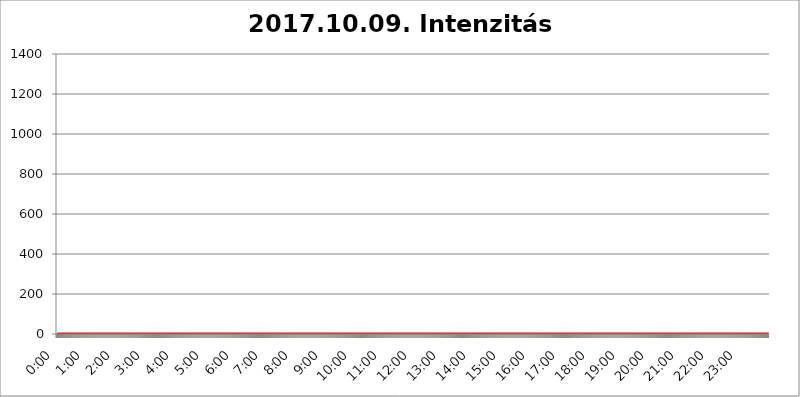
| Category | 2017.10.09. Intenzitás [W/m^2] |
|---|---|
| 0.0 | 0 |
| 0.0006944444444444445 | 0 |
| 0.001388888888888889 | 0 |
| 0.0020833333333333333 | 0 |
| 0.002777777777777778 | 0 |
| 0.003472222222222222 | 0 |
| 0.004166666666666667 | 0 |
| 0.004861111111111111 | 0 |
| 0.005555555555555556 | 0 |
| 0.0062499999999999995 | 0 |
| 0.006944444444444444 | 0 |
| 0.007638888888888889 | 0 |
| 0.008333333333333333 | 0 |
| 0.009027777777777779 | 0 |
| 0.009722222222222222 | 0 |
| 0.010416666666666666 | 0 |
| 0.011111111111111112 | 0 |
| 0.011805555555555555 | 0 |
| 0.012499999999999999 | 0 |
| 0.013194444444444444 | 0 |
| 0.013888888888888888 | 0 |
| 0.014583333333333332 | 0 |
| 0.015277777777777777 | 0 |
| 0.015972222222222224 | 0 |
| 0.016666666666666666 | 0 |
| 0.017361111111111112 | 0 |
| 0.018055555555555557 | 0 |
| 0.01875 | 0 |
| 0.019444444444444445 | 0 |
| 0.02013888888888889 | 0 |
| 0.020833333333333332 | 0 |
| 0.02152777777777778 | 0 |
| 0.022222222222222223 | 0 |
| 0.02291666666666667 | 0 |
| 0.02361111111111111 | 0 |
| 0.024305555555555556 | 0 |
| 0.024999999999999998 | 0 |
| 0.025694444444444447 | 0 |
| 0.02638888888888889 | 0 |
| 0.027083333333333334 | 0 |
| 0.027777777777777776 | 0 |
| 0.02847222222222222 | 0 |
| 0.029166666666666664 | 0 |
| 0.029861111111111113 | 0 |
| 0.030555555555555555 | 0 |
| 0.03125 | 0 |
| 0.03194444444444445 | 0 |
| 0.03263888888888889 | 0 |
| 0.03333333333333333 | 0 |
| 0.034027777777777775 | 0 |
| 0.034722222222222224 | 0 |
| 0.035416666666666666 | 0 |
| 0.036111111111111115 | 0 |
| 0.03680555555555556 | 0 |
| 0.0375 | 0 |
| 0.03819444444444444 | 0 |
| 0.03888888888888889 | 0 |
| 0.03958333333333333 | 0 |
| 0.04027777777777778 | 0 |
| 0.04097222222222222 | 0 |
| 0.041666666666666664 | 0 |
| 0.042361111111111106 | 0 |
| 0.04305555555555556 | 0 |
| 0.043750000000000004 | 0 |
| 0.044444444444444446 | 0 |
| 0.04513888888888889 | 0 |
| 0.04583333333333334 | 0 |
| 0.04652777777777778 | 0 |
| 0.04722222222222222 | 0 |
| 0.04791666666666666 | 0 |
| 0.04861111111111111 | 0 |
| 0.049305555555555554 | 0 |
| 0.049999999999999996 | 0 |
| 0.05069444444444445 | 0 |
| 0.051388888888888894 | 0 |
| 0.052083333333333336 | 0 |
| 0.05277777777777778 | 0 |
| 0.05347222222222222 | 0 |
| 0.05416666666666667 | 0 |
| 0.05486111111111111 | 0 |
| 0.05555555555555555 | 0 |
| 0.05625 | 0 |
| 0.05694444444444444 | 0 |
| 0.057638888888888885 | 0 |
| 0.05833333333333333 | 0 |
| 0.05902777777777778 | 0 |
| 0.059722222222222225 | 0 |
| 0.06041666666666667 | 0 |
| 0.061111111111111116 | 0 |
| 0.06180555555555556 | 0 |
| 0.0625 | 0 |
| 0.06319444444444444 | 0 |
| 0.06388888888888888 | 0 |
| 0.06458333333333334 | 0 |
| 0.06527777777777778 | 0 |
| 0.06597222222222222 | 0 |
| 0.06666666666666667 | 0 |
| 0.06736111111111111 | 0 |
| 0.06805555555555555 | 0 |
| 0.06874999999999999 | 0 |
| 0.06944444444444443 | 0 |
| 0.07013888888888889 | 0 |
| 0.07083333333333333 | 0 |
| 0.07152777777777779 | 0 |
| 0.07222222222222223 | 0 |
| 0.07291666666666667 | 0 |
| 0.07361111111111111 | 0 |
| 0.07430555555555556 | 0 |
| 0.075 | 0 |
| 0.07569444444444444 | 0 |
| 0.0763888888888889 | 0 |
| 0.07708333333333334 | 0 |
| 0.07777777777777778 | 0 |
| 0.07847222222222222 | 0 |
| 0.07916666666666666 | 0 |
| 0.0798611111111111 | 0 |
| 0.08055555555555556 | 0 |
| 0.08125 | 0 |
| 0.08194444444444444 | 0 |
| 0.08263888888888889 | 0 |
| 0.08333333333333333 | 0 |
| 0.08402777777777777 | 0 |
| 0.08472222222222221 | 0 |
| 0.08541666666666665 | 0 |
| 0.08611111111111112 | 0 |
| 0.08680555555555557 | 0 |
| 0.08750000000000001 | 0 |
| 0.08819444444444445 | 0 |
| 0.08888888888888889 | 0 |
| 0.08958333333333333 | 0 |
| 0.09027777777777778 | 0 |
| 0.09097222222222222 | 0 |
| 0.09166666666666667 | 0 |
| 0.09236111111111112 | 0 |
| 0.09305555555555556 | 0 |
| 0.09375 | 0 |
| 0.09444444444444444 | 0 |
| 0.09513888888888888 | 0 |
| 0.09583333333333333 | 0 |
| 0.09652777777777777 | 0 |
| 0.09722222222222222 | 0 |
| 0.09791666666666667 | 0 |
| 0.09861111111111111 | 0 |
| 0.09930555555555555 | 0 |
| 0.09999999999999999 | 0 |
| 0.10069444444444443 | 0 |
| 0.1013888888888889 | 0 |
| 0.10208333333333335 | 0 |
| 0.10277777777777779 | 0 |
| 0.10347222222222223 | 0 |
| 0.10416666666666667 | 0 |
| 0.10486111111111111 | 0 |
| 0.10555555555555556 | 0 |
| 0.10625 | 0 |
| 0.10694444444444444 | 0 |
| 0.1076388888888889 | 0 |
| 0.10833333333333334 | 0 |
| 0.10902777777777778 | 0 |
| 0.10972222222222222 | 0 |
| 0.1111111111111111 | 0 |
| 0.11180555555555556 | 0 |
| 0.11180555555555556 | 0 |
| 0.1125 | 0 |
| 0.11319444444444444 | 0 |
| 0.11388888888888889 | 0 |
| 0.11458333333333333 | 0 |
| 0.11527777777777777 | 0 |
| 0.11597222222222221 | 0 |
| 0.11666666666666665 | 0 |
| 0.1173611111111111 | 0 |
| 0.11805555555555557 | 0 |
| 0.11944444444444445 | 0 |
| 0.12013888888888889 | 0 |
| 0.12083333333333333 | 0 |
| 0.12152777777777778 | 0 |
| 0.12222222222222223 | 0 |
| 0.12291666666666667 | 0 |
| 0.12291666666666667 | 0 |
| 0.12361111111111112 | 0 |
| 0.12430555555555556 | 0 |
| 0.125 | 0 |
| 0.12569444444444444 | 0 |
| 0.12638888888888888 | 0 |
| 0.12708333333333333 | 0 |
| 0.16875 | 0 |
| 0.12847222222222224 | 0 |
| 0.12916666666666668 | 0 |
| 0.12986111111111112 | 0 |
| 0.13055555555555556 | 0 |
| 0.13125 | 0 |
| 0.13194444444444445 | 0 |
| 0.1326388888888889 | 0 |
| 0.13333333333333333 | 0 |
| 0.13402777777777777 | 0 |
| 0.13402777777777777 | 0 |
| 0.13472222222222222 | 0 |
| 0.13541666666666666 | 0 |
| 0.1361111111111111 | 0 |
| 0.13749999999999998 | 0 |
| 0.13819444444444443 | 0 |
| 0.1388888888888889 | 0 |
| 0.13958333333333334 | 0 |
| 0.14027777777777778 | 0 |
| 0.14097222222222222 | 0 |
| 0.14166666666666666 | 0 |
| 0.1423611111111111 | 0 |
| 0.14305555555555557 | 0 |
| 0.14375000000000002 | 0 |
| 0.14444444444444446 | 0 |
| 0.1451388888888889 | 0 |
| 0.1451388888888889 | 0 |
| 0.14652777777777778 | 0 |
| 0.14722222222222223 | 0 |
| 0.14791666666666667 | 0 |
| 0.1486111111111111 | 0 |
| 0.14930555555555555 | 0 |
| 0.15 | 0 |
| 0.15069444444444444 | 0 |
| 0.15138888888888888 | 0 |
| 0.15208333333333332 | 0 |
| 0.15277777777777776 | 0 |
| 0.15347222222222223 | 0 |
| 0.15416666666666667 | 0 |
| 0.15486111111111112 | 0 |
| 0.15555555555555556 | 0 |
| 0.15625 | 0 |
| 0.15694444444444444 | 0 |
| 0.15763888888888888 | 0 |
| 0.15833333333333333 | 0 |
| 0.15902777777777777 | 0 |
| 0.15972222222222224 | 0 |
| 0.16041666666666668 | 0 |
| 0.16111111111111112 | 0 |
| 0.16180555555555556 | 0 |
| 0.1625 | 0 |
| 0.16319444444444445 | 0 |
| 0.1638888888888889 | 0 |
| 0.16458333333333333 | 0 |
| 0.16527777777777777 | 0 |
| 0.16597222222222222 | 0 |
| 0.16666666666666666 | 0 |
| 0.1673611111111111 | 0 |
| 0.16805555555555554 | 0 |
| 0.16874999999999998 | 0 |
| 0.16944444444444443 | 0 |
| 0.17013888888888887 | 0 |
| 0.1708333333333333 | 0 |
| 0.17152777777777775 | 0 |
| 0.17222222222222225 | 0 |
| 0.1729166666666667 | 0 |
| 0.17361111111111113 | 0 |
| 0.17430555555555557 | 0 |
| 0.17500000000000002 | 0 |
| 0.17569444444444446 | 0 |
| 0.1763888888888889 | 0 |
| 0.17708333333333334 | 0 |
| 0.17777777777777778 | 0 |
| 0.17847222222222223 | 0 |
| 0.17916666666666667 | 0 |
| 0.1798611111111111 | 0 |
| 0.18055555555555555 | 0 |
| 0.18125 | 0 |
| 0.18194444444444444 | 0 |
| 0.1826388888888889 | 0 |
| 0.18333333333333335 | 0 |
| 0.1840277777777778 | 0 |
| 0.18472222222222223 | 0 |
| 0.18541666666666667 | 0 |
| 0.18611111111111112 | 0 |
| 0.18680555555555556 | 0 |
| 0.1875 | 0 |
| 0.18819444444444444 | 0 |
| 0.18888888888888888 | 0 |
| 0.18958333333333333 | 0 |
| 0.19027777777777777 | 0 |
| 0.1909722222222222 | 0 |
| 0.19166666666666665 | 0 |
| 0.19236111111111112 | 0 |
| 0.19305555555555554 | 0 |
| 0.19375 | 0 |
| 0.19444444444444445 | 0 |
| 0.1951388888888889 | 0 |
| 0.19583333333333333 | 0 |
| 0.19652777777777777 | 0 |
| 0.19722222222222222 | 0 |
| 0.19791666666666666 | 0 |
| 0.1986111111111111 | 0 |
| 0.19930555555555554 | 0 |
| 0.19999999999999998 | 0 |
| 0.20069444444444443 | 0 |
| 0.20138888888888887 | 0 |
| 0.2020833333333333 | 0 |
| 0.2027777777777778 | 0 |
| 0.2034722222222222 | 0 |
| 0.2041666666666667 | 0 |
| 0.20486111111111113 | 0 |
| 0.20555555555555557 | 0 |
| 0.20625000000000002 | 0 |
| 0.20694444444444446 | 0 |
| 0.2076388888888889 | 0 |
| 0.20833333333333334 | 0 |
| 0.20902777777777778 | 0 |
| 0.20972222222222223 | 0 |
| 0.21041666666666667 | 0 |
| 0.2111111111111111 | 0 |
| 0.21180555555555555 | 0 |
| 0.2125 | 0 |
| 0.21319444444444444 | 0 |
| 0.2138888888888889 | 0 |
| 0.21458333333333335 | 0 |
| 0.2152777777777778 | 0 |
| 0.21597222222222223 | 0 |
| 0.21666666666666667 | 0 |
| 0.21736111111111112 | 0 |
| 0.21805555555555556 | 0 |
| 0.21875 | 0 |
| 0.21944444444444444 | 0 |
| 0.22013888888888888 | 0 |
| 0.22083333333333333 | 0 |
| 0.22152777777777777 | 0 |
| 0.2222222222222222 | 0 |
| 0.22291666666666665 | 0 |
| 0.2236111111111111 | 0 |
| 0.22430555555555556 | 0 |
| 0.225 | 0 |
| 0.22569444444444445 | 0 |
| 0.2263888888888889 | 0 |
| 0.22708333333333333 | 0 |
| 0.22777777777777777 | 0 |
| 0.22847222222222222 | 0 |
| 0.22916666666666666 | 0 |
| 0.2298611111111111 | 0 |
| 0.23055555555555554 | 0 |
| 0.23124999999999998 | 0 |
| 0.23194444444444443 | 0 |
| 0.23263888888888887 | 0 |
| 0.2333333333333333 | 0 |
| 0.2340277777777778 | 0 |
| 0.2347222222222222 | 0 |
| 0.2354166666666667 | 0 |
| 0.23611111111111113 | 0 |
| 0.23680555555555557 | 0 |
| 0.23750000000000002 | 0 |
| 0.23819444444444446 | 0 |
| 0.2388888888888889 | 0 |
| 0.23958333333333334 | 0 |
| 0.24027777777777778 | 0 |
| 0.24097222222222223 | 0 |
| 0.24166666666666667 | 0 |
| 0.2423611111111111 | 0 |
| 0.24305555555555555 | 0 |
| 0.24375 | 0 |
| 0.24444444444444446 | 0 |
| 0.24513888888888888 | 0 |
| 0.24583333333333335 | 0 |
| 0.2465277777777778 | 0 |
| 0.24722222222222223 | 0 |
| 0.24791666666666667 | 0 |
| 0.24861111111111112 | 0 |
| 0.24930555555555556 | 0 |
| 0.25 | 0 |
| 0.25069444444444444 | 0 |
| 0.2513888888888889 | 0 |
| 0.2520833333333333 | 0 |
| 0.25277777777777777 | 0 |
| 0.2534722222222222 | 0 |
| 0.25416666666666665 | 0 |
| 0.2548611111111111 | 0 |
| 0.2555555555555556 | 0 |
| 0.25625000000000003 | 0 |
| 0.2569444444444445 | 0 |
| 0.2576388888888889 | 0 |
| 0.25833333333333336 | 0 |
| 0.2590277777777778 | 0 |
| 0.25972222222222224 | 0 |
| 0.2604166666666667 | 0 |
| 0.2611111111111111 | 0 |
| 0.26180555555555557 | 0 |
| 0.2625 | 0 |
| 0.26319444444444445 | 0 |
| 0.2638888888888889 | 0 |
| 0.26458333333333334 | 0 |
| 0.2652777777777778 | 0 |
| 0.2659722222222222 | 0 |
| 0.26666666666666666 | 0 |
| 0.2673611111111111 | 0 |
| 0.26805555555555555 | 0 |
| 0.26875 | 0 |
| 0.26944444444444443 | 0 |
| 0.2701388888888889 | 0 |
| 0.2708333333333333 | 0 |
| 0.27152777777777776 | 0 |
| 0.2722222222222222 | 0 |
| 0.27291666666666664 | 0 |
| 0.2736111111111111 | 0 |
| 0.2743055555555555 | 0 |
| 0.27499999999999997 | 0 |
| 0.27569444444444446 | 0 |
| 0.27638888888888885 | 0 |
| 0.27708333333333335 | 0 |
| 0.2777777777777778 | 0 |
| 0.27847222222222223 | 0 |
| 0.2791666666666667 | 0 |
| 0.2798611111111111 | 0 |
| 0.28055555555555556 | 0 |
| 0.28125 | 0 |
| 0.28194444444444444 | 0 |
| 0.2826388888888889 | 0 |
| 0.2833333333333333 | 0 |
| 0.28402777777777777 | 0 |
| 0.2847222222222222 | 0 |
| 0.28541666666666665 | 0 |
| 0.28611111111111115 | 0 |
| 0.28680555555555554 | 0 |
| 0.28750000000000003 | 0 |
| 0.2881944444444445 | 0 |
| 0.2888888888888889 | 0 |
| 0.28958333333333336 | 0 |
| 0.2902777777777778 | 0 |
| 0.29097222222222224 | 0 |
| 0.2916666666666667 | 0 |
| 0.2923611111111111 | 0 |
| 0.29305555555555557 | 0 |
| 0.29375 | 0 |
| 0.29444444444444445 | 0 |
| 0.2951388888888889 | 0 |
| 0.29583333333333334 | 0 |
| 0.2965277777777778 | 0 |
| 0.2972222222222222 | 0 |
| 0.29791666666666666 | 0 |
| 0.2986111111111111 | 0 |
| 0.29930555555555555 | 0 |
| 0.3 | 0 |
| 0.30069444444444443 | 0 |
| 0.3013888888888889 | 0 |
| 0.3020833333333333 | 0 |
| 0.30277777777777776 | 0 |
| 0.3034722222222222 | 0 |
| 0.30416666666666664 | 0 |
| 0.3048611111111111 | 0 |
| 0.3055555555555555 | 0 |
| 0.30624999999999997 | 0 |
| 0.3069444444444444 | 0 |
| 0.3076388888888889 | 0 |
| 0.30833333333333335 | 0 |
| 0.3090277777777778 | 0 |
| 0.30972222222222223 | 0 |
| 0.3104166666666667 | 0 |
| 0.3111111111111111 | 0 |
| 0.31180555555555556 | 0 |
| 0.3125 | 0 |
| 0.31319444444444444 | 0 |
| 0.3138888888888889 | 0 |
| 0.3145833333333333 | 0 |
| 0.31527777777777777 | 0 |
| 0.3159722222222222 | 0 |
| 0.31666666666666665 | 0 |
| 0.31736111111111115 | 0 |
| 0.31805555555555554 | 0 |
| 0.31875000000000003 | 0 |
| 0.3194444444444445 | 0 |
| 0.3201388888888889 | 0 |
| 0.32083333333333336 | 0 |
| 0.3215277777777778 | 0 |
| 0.32222222222222224 | 0 |
| 0.3229166666666667 | 0 |
| 0.3236111111111111 | 0 |
| 0.32430555555555557 | 0 |
| 0.325 | 0 |
| 0.32569444444444445 | 0 |
| 0.3263888888888889 | 0 |
| 0.32708333333333334 | 0 |
| 0.3277777777777778 | 0 |
| 0.3284722222222222 | 0 |
| 0.32916666666666666 | 0 |
| 0.3298611111111111 | 0 |
| 0.33055555555555555 | 0 |
| 0.33125 | 0 |
| 0.33194444444444443 | 0 |
| 0.3326388888888889 | 0 |
| 0.3333333333333333 | 0 |
| 0.3340277777777778 | 0 |
| 0.3347222222222222 | 0 |
| 0.3354166666666667 | 0 |
| 0.3361111111111111 | 0 |
| 0.3368055555555556 | 0 |
| 0.33749999999999997 | 0 |
| 0.33819444444444446 | 0 |
| 0.33888888888888885 | 0 |
| 0.33958333333333335 | 0 |
| 0.34027777777777773 | 0 |
| 0.34097222222222223 | 0 |
| 0.3416666666666666 | 0 |
| 0.3423611111111111 | 0 |
| 0.3430555555555555 | 0 |
| 0.34375 | 0 |
| 0.3444444444444445 | 0 |
| 0.3451388888888889 | 0 |
| 0.3458333333333334 | 0 |
| 0.34652777777777777 | 0 |
| 0.34722222222222227 | 0 |
| 0.34791666666666665 | 0 |
| 0.34861111111111115 | 0 |
| 0.34930555555555554 | 0 |
| 0.35000000000000003 | 0 |
| 0.3506944444444444 | 0 |
| 0.3513888888888889 | 0 |
| 0.3520833333333333 | 0 |
| 0.3527777777777778 | 0 |
| 0.3534722222222222 | 0 |
| 0.3541666666666667 | 0 |
| 0.3548611111111111 | 0 |
| 0.35555555555555557 | 0 |
| 0.35625 | 0 |
| 0.35694444444444445 | 0 |
| 0.3576388888888889 | 0 |
| 0.35833333333333334 | 0 |
| 0.3590277777777778 | 0 |
| 0.3597222222222222 | 0 |
| 0.36041666666666666 | 0 |
| 0.3611111111111111 | 0 |
| 0.36180555555555555 | 0 |
| 0.3625 | 0 |
| 0.36319444444444443 | 0 |
| 0.3638888888888889 | 0 |
| 0.3645833333333333 | 0 |
| 0.3652777777777778 | 0 |
| 0.3659722222222222 | 0 |
| 0.3666666666666667 | 0 |
| 0.3673611111111111 | 0 |
| 0.3680555555555556 | 0 |
| 0.36874999999999997 | 0 |
| 0.36944444444444446 | 0 |
| 0.37013888888888885 | 0 |
| 0.37083333333333335 | 0 |
| 0.37152777777777773 | 0 |
| 0.37222222222222223 | 0 |
| 0.3729166666666666 | 0 |
| 0.3736111111111111 | 0 |
| 0.3743055555555555 | 0 |
| 0.375 | 0 |
| 0.3756944444444445 | 0 |
| 0.3763888888888889 | 0 |
| 0.3770833333333334 | 0 |
| 0.37777777777777777 | 0 |
| 0.37847222222222227 | 0 |
| 0.37916666666666665 | 0 |
| 0.37986111111111115 | 0 |
| 0.38055555555555554 | 0 |
| 0.38125000000000003 | 0 |
| 0.3819444444444444 | 0 |
| 0.3826388888888889 | 0 |
| 0.3833333333333333 | 0 |
| 0.3840277777777778 | 0 |
| 0.3847222222222222 | 0 |
| 0.3854166666666667 | 0 |
| 0.3861111111111111 | 0 |
| 0.38680555555555557 | 0 |
| 0.3875 | 0 |
| 0.38819444444444445 | 0 |
| 0.3888888888888889 | 0 |
| 0.38958333333333334 | 0 |
| 0.3902777777777778 | 0 |
| 0.3909722222222222 | 0 |
| 0.39166666666666666 | 0 |
| 0.3923611111111111 | 0 |
| 0.39305555555555555 | 0 |
| 0.39375 | 0 |
| 0.39444444444444443 | 0 |
| 0.3951388888888889 | 0 |
| 0.3958333333333333 | 0 |
| 0.3965277777777778 | 0 |
| 0.3972222222222222 | 0 |
| 0.3979166666666667 | 0 |
| 0.3986111111111111 | 0 |
| 0.3993055555555556 | 0 |
| 0.39999999999999997 | 0 |
| 0.40069444444444446 | 0 |
| 0.40138888888888885 | 0 |
| 0.40208333333333335 | 0 |
| 0.40277777777777773 | 0 |
| 0.40347222222222223 | 0 |
| 0.4041666666666666 | 0 |
| 0.4048611111111111 | 0 |
| 0.4055555555555555 | 0 |
| 0.40625 | 0 |
| 0.4069444444444445 | 0 |
| 0.4076388888888889 | 0 |
| 0.4083333333333334 | 0 |
| 0.40902777777777777 | 0 |
| 0.40972222222222227 | 0 |
| 0.41041666666666665 | 0 |
| 0.41111111111111115 | 0 |
| 0.41180555555555554 | 0 |
| 0.41250000000000003 | 0 |
| 0.4131944444444444 | 0 |
| 0.4138888888888889 | 0 |
| 0.4145833333333333 | 0 |
| 0.4152777777777778 | 0 |
| 0.4159722222222222 | 0 |
| 0.4166666666666667 | 0 |
| 0.4173611111111111 | 0 |
| 0.41805555555555557 | 0 |
| 0.41875 | 0 |
| 0.41944444444444445 | 0 |
| 0.4201388888888889 | 0 |
| 0.42083333333333334 | 0 |
| 0.4215277777777778 | 0 |
| 0.4222222222222222 | 0 |
| 0.42291666666666666 | 0 |
| 0.4236111111111111 | 0 |
| 0.42430555555555555 | 0 |
| 0.425 | 0 |
| 0.42569444444444443 | 0 |
| 0.4263888888888889 | 0 |
| 0.4270833333333333 | 0 |
| 0.4277777777777778 | 0 |
| 0.4284722222222222 | 0 |
| 0.4291666666666667 | 0 |
| 0.4298611111111111 | 0 |
| 0.4305555555555556 | 0 |
| 0.43124999999999997 | 0 |
| 0.43194444444444446 | 0 |
| 0.43263888888888885 | 0 |
| 0.43333333333333335 | 0 |
| 0.43402777777777773 | 0 |
| 0.43472222222222223 | 0 |
| 0.4354166666666666 | 0 |
| 0.4361111111111111 | 0 |
| 0.4368055555555555 | 0 |
| 0.4375 | 0 |
| 0.4381944444444445 | 0 |
| 0.4388888888888889 | 0 |
| 0.4395833333333334 | 0 |
| 0.44027777777777777 | 0 |
| 0.44097222222222227 | 0 |
| 0.44166666666666665 | 0 |
| 0.44236111111111115 | 0 |
| 0.44305555555555554 | 0 |
| 0.44375000000000003 | 0 |
| 0.4444444444444444 | 0 |
| 0.4451388888888889 | 0 |
| 0.4458333333333333 | 0 |
| 0.4465277777777778 | 0 |
| 0.4472222222222222 | 0 |
| 0.4479166666666667 | 0 |
| 0.4486111111111111 | 0 |
| 0.44930555555555557 | 0 |
| 0.45 | 0 |
| 0.45069444444444445 | 0 |
| 0.4513888888888889 | 0 |
| 0.45208333333333334 | 0 |
| 0.4527777777777778 | 0 |
| 0.4534722222222222 | 0 |
| 0.45416666666666666 | 0 |
| 0.4548611111111111 | 0 |
| 0.45555555555555555 | 0 |
| 0.45625 | 0 |
| 0.45694444444444443 | 0 |
| 0.4576388888888889 | 0 |
| 0.4583333333333333 | 0 |
| 0.4590277777777778 | 0 |
| 0.4597222222222222 | 0 |
| 0.4604166666666667 | 0 |
| 0.4611111111111111 | 0 |
| 0.4618055555555556 | 0 |
| 0.46249999999999997 | 0 |
| 0.46319444444444446 | 0 |
| 0.46388888888888885 | 0 |
| 0.46458333333333335 | 0 |
| 0.46527777777777773 | 0 |
| 0.46597222222222223 | 0 |
| 0.4666666666666666 | 0 |
| 0.4673611111111111 | 0 |
| 0.4680555555555555 | 0 |
| 0.46875 | 0 |
| 0.4694444444444445 | 0 |
| 0.4701388888888889 | 0 |
| 0.4708333333333334 | 0 |
| 0.47152777777777777 | 0 |
| 0.47222222222222227 | 0 |
| 0.47291666666666665 | 0 |
| 0.47361111111111115 | 0 |
| 0.47430555555555554 | 0 |
| 0.47500000000000003 | 0 |
| 0.4756944444444444 | 0 |
| 0.4763888888888889 | 0 |
| 0.4770833333333333 | 0 |
| 0.4777777777777778 | 0 |
| 0.4784722222222222 | 0 |
| 0.4791666666666667 | 0 |
| 0.4798611111111111 | 0 |
| 0.48055555555555557 | 0 |
| 0.48125 | 0 |
| 0.48194444444444445 | 0 |
| 0.4826388888888889 | 0 |
| 0.48333333333333334 | 0 |
| 0.4840277777777778 | 0 |
| 0.4847222222222222 | 0 |
| 0.48541666666666666 | 0 |
| 0.4861111111111111 | 0 |
| 0.48680555555555555 | 0 |
| 0.4875 | 0 |
| 0.48819444444444443 | 0 |
| 0.4888888888888889 | 0 |
| 0.4895833333333333 | 0 |
| 0.4902777777777778 | 0 |
| 0.4909722222222222 | 0 |
| 0.4916666666666667 | 0 |
| 0.4923611111111111 | 0 |
| 0.4930555555555556 | 0 |
| 0.49374999999999997 | 0 |
| 0.49444444444444446 | 0 |
| 0.49513888888888885 | 0 |
| 0.49583333333333335 | 0 |
| 0.49652777777777773 | 0 |
| 0.49722222222222223 | 0 |
| 0.4979166666666666 | 0 |
| 0.4986111111111111 | 0 |
| 0.4993055555555555 | 0 |
| 0.5 | 0 |
| 0.5006944444444444 | 0 |
| 0.5013888888888889 | 0 |
| 0.5020833333333333 | 0 |
| 0.5027777777777778 | 0 |
| 0.5034722222222222 | 0 |
| 0.5041666666666667 | 0 |
| 0.5048611111111111 | 0 |
| 0.5055555555555555 | 0 |
| 0.50625 | 0 |
| 0.5069444444444444 | 0 |
| 0.5076388888888889 | 0 |
| 0.5083333333333333 | 0 |
| 0.5090277777777777 | 0 |
| 0.5097222222222222 | 0 |
| 0.5104166666666666 | 0 |
| 0.5111111111111112 | 0 |
| 0.5118055555555555 | 0 |
| 0.5125000000000001 | 0 |
| 0.5131944444444444 | 0 |
| 0.513888888888889 | 0 |
| 0.5145833333333333 | 0 |
| 0.5152777777777778 | 0 |
| 0.5159722222222222 | 0 |
| 0.5166666666666667 | 0 |
| 0.517361111111111 | 0 |
| 0.5180555555555556 | 0 |
| 0.5187499999999999 | 0 |
| 0.5194444444444445 | 0 |
| 0.5201388888888888 | 0 |
| 0.5208333333333334 | 0 |
| 0.5215277777777778 | 0 |
| 0.5222222222222223 | 0 |
| 0.5229166666666667 | 0 |
| 0.5236111111111111 | 0 |
| 0.5243055555555556 | 0 |
| 0.525 | 0 |
| 0.5256944444444445 | 0 |
| 0.5263888888888889 | 0 |
| 0.5270833333333333 | 0 |
| 0.5277777777777778 | 0 |
| 0.5284722222222222 | 0 |
| 0.5291666666666667 | 0 |
| 0.5298611111111111 | 0 |
| 0.5305555555555556 | 0 |
| 0.53125 | 0 |
| 0.5319444444444444 | 0 |
| 0.5326388888888889 | 0 |
| 0.5333333333333333 | 0 |
| 0.5340277777777778 | 0 |
| 0.5347222222222222 | 0 |
| 0.5354166666666667 | 0 |
| 0.5361111111111111 | 0 |
| 0.5368055555555555 | 0 |
| 0.5375 | 0 |
| 0.5381944444444444 | 0 |
| 0.5388888888888889 | 0 |
| 0.5395833333333333 | 0 |
| 0.5402777777777777 | 0 |
| 0.5409722222222222 | 0 |
| 0.5416666666666666 | 0 |
| 0.5423611111111112 | 0 |
| 0.5430555555555555 | 0 |
| 0.5437500000000001 | 0 |
| 0.5444444444444444 | 0 |
| 0.545138888888889 | 0 |
| 0.5458333333333333 | 0 |
| 0.5465277777777778 | 0 |
| 0.5472222222222222 | 0 |
| 0.5479166666666667 | 0 |
| 0.548611111111111 | 0 |
| 0.5493055555555556 | 0 |
| 0.5499999999999999 | 0 |
| 0.5506944444444445 | 0 |
| 0.5513888888888888 | 0 |
| 0.5520833333333334 | 0 |
| 0.5527777777777778 | 0 |
| 0.5534722222222223 | 0 |
| 0.5541666666666667 | 0 |
| 0.5548611111111111 | 0 |
| 0.5555555555555556 | 0 |
| 0.55625 | 0 |
| 0.5569444444444445 | 0 |
| 0.5576388888888889 | 0 |
| 0.5583333333333333 | 0 |
| 0.5590277777777778 | 0 |
| 0.5597222222222222 | 0 |
| 0.5604166666666667 | 0 |
| 0.5611111111111111 | 0 |
| 0.5618055555555556 | 0 |
| 0.5625 | 0 |
| 0.5631944444444444 | 0 |
| 0.5638888888888889 | 0 |
| 0.5645833333333333 | 0 |
| 0.5652777777777778 | 0 |
| 0.5659722222222222 | 0 |
| 0.5666666666666667 | 0 |
| 0.5673611111111111 | 0 |
| 0.5680555555555555 | 0 |
| 0.56875 | 0 |
| 0.5694444444444444 | 0 |
| 0.5701388888888889 | 0 |
| 0.5708333333333333 | 0 |
| 0.5715277777777777 | 0 |
| 0.5722222222222222 | 0 |
| 0.5729166666666666 | 0 |
| 0.5736111111111112 | 0 |
| 0.5743055555555555 | 0 |
| 0.5750000000000001 | 0 |
| 0.5756944444444444 | 0 |
| 0.576388888888889 | 0 |
| 0.5770833333333333 | 0 |
| 0.5777777777777778 | 0 |
| 0.5784722222222222 | 0 |
| 0.5791666666666667 | 0 |
| 0.579861111111111 | 0 |
| 0.5805555555555556 | 0 |
| 0.5812499999999999 | 0 |
| 0.5819444444444445 | 0 |
| 0.5826388888888888 | 0 |
| 0.5833333333333334 | 0 |
| 0.5840277777777778 | 0 |
| 0.5847222222222223 | 0 |
| 0.5854166666666667 | 0 |
| 0.5861111111111111 | 0 |
| 0.5868055555555556 | 0 |
| 0.5875 | 0 |
| 0.5881944444444445 | 0 |
| 0.5888888888888889 | 0 |
| 0.5895833333333333 | 0 |
| 0.5902777777777778 | 0 |
| 0.5909722222222222 | 0 |
| 0.5916666666666667 | 0 |
| 0.5923611111111111 | 0 |
| 0.5930555555555556 | 0 |
| 0.59375 | 0 |
| 0.5944444444444444 | 0 |
| 0.5951388888888889 | 0 |
| 0.5958333333333333 | 0 |
| 0.5965277777777778 | 0 |
| 0.5972222222222222 | 0 |
| 0.5979166666666667 | 0 |
| 0.5986111111111111 | 0 |
| 0.5993055555555555 | 0 |
| 0.6 | 0 |
| 0.6006944444444444 | 0 |
| 0.6013888888888889 | 0 |
| 0.6020833333333333 | 0 |
| 0.6027777777777777 | 0 |
| 0.6034722222222222 | 0 |
| 0.6041666666666666 | 0 |
| 0.6048611111111112 | 0 |
| 0.6055555555555555 | 0 |
| 0.6062500000000001 | 0 |
| 0.6069444444444444 | 0 |
| 0.607638888888889 | 0 |
| 0.6083333333333333 | 0 |
| 0.6090277777777778 | 0 |
| 0.6097222222222222 | 0 |
| 0.6104166666666667 | 0 |
| 0.611111111111111 | 0 |
| 0.6118055555555556 | 0 |
| 0.6124999999999999 | 0 |
| 0.6131944444444445 | 0 |
| 0.6138888888888888 | 0 |
| 0.6145833333333334 | 0 |
| 0.6152777777777778 | 0 |
| 0.6159722222222223 | 0 |
| 0.6166666666666667 | 0 |
| 0.6173611111111111 | 0 |
| 0.6180555555555556 | 0 |
| 0.61875 | 0 |
| 0.6194444444444445 | 0 |
| 0.6201388888888889 | 0 |
| 0.6208333333333333 | 0 |
| 0.6215277777777778 | 0 |
| 0.6222222222222222 | 0 |
| 0.6229166666666667 | 0 |
| 0.6236111111111111 | 0 |
| 0.6243055555555556 | 0 |
| 0.625 | 0 |
| 0.6256944444444444 | 0 |
| 0.6263888888888889 | 0 |
| 0.6270833333333333 | 0 |
| 0.6277777777777778 | 0 |
| 0.6284722222222222 | 0 |
| 0.6291666666666667 | 0 |
| 0.6298611111111111 | 0 |
| 0.6305555555555555 | 0 |
| 0.63125 | 0 |
| 0.6319444444444444 | 0 |
| 0.6326388888888889 | 0 |
| 0.6333333333333333 | 0 |
| 0.6340277777777777 | 0 |
| 0.6347222222222222 | 0 |
| 0.6354166666666666 | 0 |
| 0.6361111111111112 | 0 |
| 0.6368055555555555 | 0 |
| 0.6375000000000001 | 0 |
| 0.6381944444444444 | 0 |
| 0.638888888888889 | 0 |
| 0.6395833333333333 | 0 |
| 0.6402777777777778 | 0 |
| 0.6409722222222222 | 0 |
| 0.6416666666666667 | 0 |
| 0.642361111111111 | 0 |
| 0.6430555555555556 | 0 |
| 0.6437499999999999 | 0 |
| 0.6444444444444445 | 0 |
| 0.6451388888888888 | 0 |
| 0.6458333333333334 | 0 |
| 0.6465277777777778 | 0 |
| 0.6472222222222223 | 0 |
| 0.6479166666666667 | 0 |
| 0.6486111111111111 | 0 |
| 0.6493055555555556 | 0 |
| 0.65 | 0 |
| 0.6506944444444445 | 0 |
| 0.6513888888888889 | 0 |
| 0.6520833333333333 | 0 |
| 0.6527777777777778 | 0 |
| 0.6534722222222222 | 0 |
| 0.6541666666666667 | 0 |
| 0.6548611111111111 | 0 |
| 0.6555555555555556 | 0 |
| 0.65625 | 0 |
| 0.6569444444444444 | 0 |
| 0.6576388888888889 | 0 |
| 0.6583333333333333 | 0 |
| 0.6590277777777778 | 0 |
| 0.6597222222222222 | 0 |
| 0.6604166666666667 | 0 |
| 0.6611111111111111 | 0 |
| 0.6618055555555555 | 0 |
| 0.6625 | 0 |
| 0.6631944444444444 | 0 |
| 0.6638888888888889 | 0 |
| 0.6645833333333333 | 0 |
| 0.6652777777777777 | 0 |
| 0.6659722222222222 | 0 |
| 0.6666666666666666 | 0 |
| 0.6673611111111111 | 0 |
| 0.6680555555555556 | 0 |
| 0.6687500000000001 | 0 |
| 0.6694444444444444 | 0 |
| 0.6701388888888888 | 0 |
| 0.6708333333333334 | 0 |
| 0.6715277777777778 | 0 |
| 0.6722222222222222 | 0 |
| 0.6729166666666666 | 0 |
| 0.6736111111111112 | 0 |
| 0.6743055555555556 | 0 |
| 0.6749999999999999 | 0 |
| 0.6756944444444444 | 0 |
| 0.6763888888888889 | 0 |
| 0.6770833333333334 | 0 |
| 0.6777777777777777 | 0 |
| 0.6784722222222223 | 0 |
| 0.6791666666666667 | 0 |
| 0.6798611111111111 | 0 |
| 0.6805555555555555 | 0 |
| 0.68125 | 0 |
| 0.6819444444444445 | 0 |
| 0.6826388888888889 | 0 |
| 0.6833333333333332 | 0 |
| 0.6840277777777778 | 0 |
| 0.6847222222222222 | 0 |
| 0.6854166666666667 | 0 |
| 0.686111111111111 | 0 |
| 0.6868055555555556 | 0 |
| 0.6875 | 0 |
| 0.6881944444444444 | 0 |
| 0.688888888888889 | 0 |
| 0.6895833333333333 | 0 |
| 0.6902777777777778 | 0 |
| 0.6909722222222222 | 0 |
| 0.6916666666666668 | 0 |
| 0.6923611111111111 | 0 |
| 0.6930555555555555 | 0 |
| 0.69375 | 0 |
| 0.6944444444444445 | 0 |
| 0.6951388888888889 | 0 |
| 0.6958333333333333 | 0 |
| 0.6965277777777777 | 0 |
| 0.6972222222222223 | 0 |
| 0.6979166666666666 | 0 |
| 0.6986111111111111 | 0 |
| 0.6993055555555556 | 0 |
| 0.7000000000000001 | 0 |
| 0.7006944444444444 | 0 |
| 0.7013888888888888 | 0 |
| 0.7020833333333334 | 0 |
| 0.7027777777777778 | 0 |
| 0.7034722222222222 | 0 |
| 0.7041666666666666 | 0 |
| 0.7048611111111112 | 0 |
| 0.7055555555555556 | 0 |
| 0.7062499999999999 | 0 |
| 0.7069444444444444 | 0 |
| 0.7076388888888889 | 0 |
| 0.7083333333333334 | 0 |
| 0.7090277777777777 | 0 |
| 0.7097222222222223 | 0 |
| 0.7104166666666667 | 0 |
| 0.7111111111111111 | 0 |
| 0.7118055555555555 | 0 |
| 0.7125 | 0 |
| 0.7131944444444445 | 0 |
| 0.7138888888888889 | 0 |
| 0.7145833333333332 | 0 |
| 0.7152777777777778 | 0 |
| 0.7159722222222222 | 0 |
| 0.7166666666666667 | 0 |
| 0.717361111111111 | 0 |
| 0.7180555555555556 | 0 |
| 0.71875 | 0 |
| 0.7194444444444444 | 0 |
| 0.720138888888889 | 0 |
| 0.7208333333333333 | 0 |
| 0.7215277777777778 | 0 |
| 0.7222222222222222 | 0 |
| 0.7229166666666668 | 0 |
| 0.7236111111111111 | 0 |
| 0.7243055555555555 | 0 |
| 0.725 | 0 |
| 0.7256944444444445 | 0 |
| 0.7263888888888889 | 0 |
| 0.7270833333333333 | 0 |
| 0.7277777777777777 | 0 |
| 0.7284722222222223 | 0 |
| 0.7291666666666666 | 0 |
| 0.7298611111111111 | 0 |
| 0.7305555555555556 | 0 |
| 0.7312500000000001 | 0 |
| 0.7319444444444444 | 0 |
| 0.7326388888888888 | 0 |
| 0.7333333333333334 | 0 |
| 0.7340277777777778 | 0 |
| 0.7347222222222222 | 0 |
| 0.7354166666666666 | 0 |
| 0.7361111111111112 | 0 |
| 0.7368055555555556 | 0 |
| 0.7374999999999999 | 0 |
| 0.7381944444444444 | 0 |
| 0.7388888888888889 | 0 |
| 0.7395833333333334 | 0 |
| 0.7402777777777777 | 0 |
| 0.7409722222222223 | 0 |
| 0.7416666666666667 | 0 |
| 0.7423611111111111 | 0 |
| 0.7430555555555555 | 0 |
| 0.74375 | 0 |
| 0.7444444444444445 | 0 |
| 0.7451388888888889 | 0 |
| 0.7458333333333332 | 0 |
| 0.7465277777777778 | 0 |
| 0.7472222222222222 | 0 |
| 0.7479166666666667 | 0 |
| 0.748611111111111 | 0 |
| 0.7493055555555556 | 0 |
| 0.75 | 0 |
| 0.7506944444444444 | 0 |
| 0.751388888888889 | 0 |
| 0.7520833333333333 | 0 |
| 0.7527777777777778 | 0 |
| 0.7534722222222222 | 0 |
| 0.7541666666666668 | 0 |
| 0.7548611111111111 | 0 |
| 0.7555555555555555 | 0 |
| 0.75625 | 0 |
| 0.7569444444444445 | 0 |
| 0.7576388888888889 | 0 |
| 0.7583333333333333 | 0 |
| 0.7590277777777777 | 0 |
| 0.7597222222222223 | 0 |
| 0.7604166666666666 | 0 |
| 0.7611111111111111 | 0 |
| 0.7618055555555556 | 0 |
| 0.7625000000000001 | 0 |
| 0.7631944444444444 | 0 |
| 0.7638888888888888 | 0 |
| 0.7645833333333334 | 0 |
| 0.7652777777777778 | 0 |
| 0.7659722222222222 | 0 |
| 0.7666666666666666 | 0 |
| 0.7673611111111112 | 0 |
| 0.7680555555555556 | 0 |
| 0.7687499999999999 | 0 |
| 0.7694444444444444 | 0 |
| 0.7701388888888889 | 0 |
| 0.7708333333333334 | 0 |
| 0.7715277777777777 | 0 |
| 0.7722222222222223 | 0 |
| 0.7729166666666667 | 0 |
| 0.7736111111111111 | 0 |
| 0.7743055555555555 | 0 |
| 0.775 | 0 |
| 0.7756944444444445 | 0 |
| 0.7763888888888889 | 0 |
| 0.7770833333333332 | 0 |
| 0.7777777777777778 | 0 |
| 0.7784722222222222 | 0 |
| 0.7791666666666667 | 0 |
| 0.779861111111111 | 0 |
| 0.7805555555555556 | 0 |
| 0.78125 | 0 |
| 0.7819444444444444 | 0 |
| 0.782638888888889 | 0 |
| 0.7833333333333333 | 0 |
| 0.7840277777777778 | 0 |
| 0.7847222222222222 | 0 |
| 0.7854166666666668 | 0 |
| 0.7861111111111111 | 0 |
| 0.7868055555555555 | 0 |
| 0.7875 | 0 |
| 0.7881944444444445 | 0 |
| 0.7888888888888889 | 0 |
| 0.7895833333333333 | 0 |
| 0.7902777777777777 | 0 |
| 0.7909722222222223 | 0 |
| 0.7916666666666666 | 0 |
| 0.7923611111111111 | 0 |
| 0.7930555555555556 | 0 |
| 0.7937500000000001 | 0 |
| 0.7944444444444444 | 0 |
| 0.7951388888888888 | 0 |
| 0.7958333333333334 | 0 |
| 0.7965277777777778 | 0 |
| 0.7972222222222222 | 0 |
| 0.7979166666666666 | 0 |
| 0.7986111111111112 | 0 |
| 0.7993055555555556 | 0 |
| 0.7999999999999999 | 0 |
| 0.8006944444444444 | 0 |
| 0.8013888888888889 | 0 |
| 0.8020833333333334 | 0 |
| 0.8027777777777777 | 0 |
| 0.8034722222222223 | 0 |
| 0.8041666666666667 | 0 |
| 0.8048611111111111 | 0 |
| 0.8055555555555555 | 0 |
| 0.80625 | 0 |
| 0.8069444444444445 | 0 |
| 0.8076388888888889 | 0 |
| 0.8083333333333332 | 0 |
| 0.8090277777777778 | 0 |
| 0.8097222222222222 | 0 |
| 0.8104166666666667 | 0 |
| 0.811111111111111 | 0 |
| 0.8118055555555556 | 0 |
| 0.8125 | 0 |
| 0.8131944444444444 | 0 |
| 0.813888888888889 | 0 |
| 0.8145833333333333 | 0 |
| 0.8152777777777778 | 0 |
| 0.8159722222222222 | 0 |
| 0.8166666666666668 | 0 |
| 0.8173611111111111 | 0 |
| 0.8180555555555555 | 0 |
| 0.81875 | 0 |
| 0.8194444444444445 | 0 |
| 0.8201388888888889 | 0 |
| 0.8208333333333333 | 0 |
| 0.8215277777777777 | 0 |
| 0.8222222222222223 | 0 |
| 0.8229166666666666 | 0 |
| 0.8236111111111111 | 0 |
| 0.8243055555555556 | 0 |
| 0.8250000000000001 | 0 |
| 0.8256944444444444 | 0 |
| 0.8263888888888888 | 0 |
| 0.8270833333333334 | 0 |
| 0.8277777777777778 | 0 |
| 0.8284722222222222 | 0 |
| 0.8291666666666666 | 0 |
| 0.8298611111111112 | 0 |
| 0.8305555555555556 | 0 |
| 0.8312499999999999 | 0 |
| 0.8319444444444444 | 0 |
| 0.8326388888888889 | 0 |
| 0.8333333333333334 | 0 |
| 0.8340277777777777 | 0 |
| 0.8347222222222223 | 0 |
| 0.8354166666666667 | 0 |
| 0.8361111111111111 | 0 |
| 0.8368055555555555 | 0 |
| 0.8375 | 0 |
| 0.8381944444444445 | 0 |
| 0.8388888888888889 | 0 |
| 0.8395833333333332 | 0 |
| 0.8402777777777778 | 0 |
| 0.8409722222222222 | 0 |
| 0.8416666666666667 | 0 |
| 0.842361111111111 | 0 |
| 0.8430555555555556 | 0 |
| 0.84375 | 0 |
| 0.8444444444444444 | 0 |
| 0.845138888888889 | 0 |
| 0.8458333333333333 | 0 |
| 0.8465277777777778 | 0 |
| 0.8472222222222222 | 0 |
| 0.8479166666666668 | 0 |
| 0.8486111111111111 | 0 |
| 0.8493055555555555 | 0 |
| 0.85 | 0 |
| 0.8506944444444445 | 0 |
| 0.8513888888888889 | 0 |
| 0.8520833333333333 | 0 |
| 0.8527777777777777 | 0 |
| 0.8534722222222223 | 0 |
| 0.8541666666666666 | 0 |
| 0.8548611111111111 | 0 |
| 0.8555555555555556 | 0 |
| 0.8562500000000001 | 0 |
| 0.8569444444444444 | 0 |
| 0.8576388888888888 | 0 |
| 0.8583333333333334 | 0 |
| 0.8590277777777778 | 0 |
| 0.8597222222222222 | 0 |
| 0.8604166666666666 | 0 |
| 0.8611111111111112 | 0 |
| 0.8618055555555556 | 0 |
| 0.8624999999999999 | 0 |
| 0.8631944444444444 | 0 |
| 0.8638888888888889 | 0 |
| 0.8645833333333334 | 0 |
| 0.8652777777777777 | 0 |
| 0.8659722222222223 | 0 |
| 0.8666666666666667 | 0 |
| 0.8673611111111111 | 0 |
| 0.8680555555555555 | 0 |
| 0.86875 | 0 |
| 0.8694444444444445 | 0 |
| 0.8701388888888889 | 0 |
| 0.8708333333333332 | 0 |
| 0.8715277777777778 | 0 |
| 0.8722222222222222 | 0 |
| 0.8729166666666667 | 0 |
| 0.873611111111111 | 0 |
| 0.8743055555555556 | 0 |
| 0.875 | 0 |
| 0.8756944444444444 | 0 |
| 0.876388888888889 | 0 |
| 0.8770833333333333 | 0 |
| 0.8777777777777778 | 0 |
| 0.8784722222222222 | 0 |
| 0.8791666666666668 | 0 |
| 0.8798611111111111 | 0 |
| 0.8805555555555555 | 0 |
| 0.88125 | 0 |
| 0.8819444444444445 | 0 |
| 0.8826388888888889 | 0 |
| 0.8833333333333333 | 0 |
| 0.8840277777777777 | 0 |
| 0.8847222222222223 | 0 |
| 0.8854166666666666 | 0 |
| 0.8861111111111111 | 0 |
| 0.8868055555555556 | 0 |
| 0.8875000000000001 | 0 |
| 0.8881944444444444 | 0 |
| 0.8888888888888888 | 0 |
| 0.8895833333333334 | 0 |
| 0.8902777777777778 | 0 |
| 0.8909722222222222 | 0 |
| 0.8916666666666666 | 0 |
| 0.8923611111111112 | 0 |
| 0.8930555555555556 | 0 |
| 0.8937499999999999 | 0 |
| 0.8944444444444444 | 0 |
| 0.8951388888888889 | 0 |
| 0.8958333333333334 | 0 |
| 0.8965277777777777 | 0 |
| 0.8972222222222223 | 0 |
| 0.8979166666666667 | 0 |
| 0.8986111111111111 | 0 |
| 0.8993055555555555 | 0 |
| 0.9 | 0 |
| 0.9006944444444445 | 0 |
| 0.9013888888888889 | 0 |
| 0.9020833333333332 | 0 |
| 0.9027777777777778 | 0 |
| 0.9034722222222222 | 0 |
| 0.9041666666666667 | 0 |
| 0.904861111111111 | 0 |
| 0.9055555555555556 | 0 |
| 0.90625 | 0 |
| 0.9069444444444444 | 0 |
| 0.907638888888889 | 0 |
| 0.9083333333333333 | 0 |
| 0.9090277777777778 | 0 |
| 0.9097222222222222 | 0 |
| 0.9104166666666668 | 0 |
| 0.9111111111111111 | 0 |
| 0.9118055555555555 | 0 |
| 0.9125 | 0 |
| 0.9131944444444445 | 0 |
| 0.9138888888888889 | 0 |
| 0.9145833333333333 | 0 |
| 0.9152777777777777 | 0 |
| 0.9159722222222223 | 0 |
| 0.9166666666666666 | 0 |
| 0.9173611111111111 | 0 |
| 0.9180555555555556 | 0 |
| 0.9187500000000001 | 0 |
| 0.9194444444444444 | 0 |
| 0.9201388888888888 | 0 |
| 0.9208333333333334 | 0 |
| 0.9215277777777778 | 0 |
| 0.9222222222222222 | 0 |
| 0.9229166666666666 | 0 |
| 0.9236111111111112 | 0 |
| 0.9243055555555556 | 0 |
| 0.9249999999999999 | 0 |
| 0.9256944444444444 | 0 |
| 0.9263888888888889 | 0 |
| 0.9270833333333334 | 0 |
| 0.9277777777777777 | 0 |
| 0.9284722222222223 | 0 |
| 0.9291666666666667 | 0 |
| 0.9298611111111111 | 0 |
| 0.9305555555555555 | 0 |
| 0.93125 | 0 |
| 0.9319444444444445 | 0 |
| 0.9326388888888889 | 0 |
| 0.9333333333333332 | 0 |
| 0.9340277777777778 | 0 |
| 0.9347222222222222 | 0 |
| 0.9354166666666667 | 0 |
| 0.936111111111111 | 0 |
| 0.9368055555555556 | 0 |
| 0.9375 | 0 |
| 0.9381944444444444 | 0 |
| 0.938888888888889 | 0 |
| 0.9395833333333333 | 0 |
| 0.9402777777777778 | 0 |
| 0.9409722222222222 | 0 |
| 0.9416666666666668 | 0 |
| 0.9423611111111111 | 0 |
| 0.9430555555555555 | 0 |
| 0.94375 | 0 |
| 0.9444444444444445 | 0 |
| 0.9451388888888889 | 0 |
| 0.9458333333333333 | 0 |
| 0.9465277777777777 | 0 |
| 0.9472222222222223 | 0 |
| 0.9479166666666666 | 0 |
| 0.9486111111111111 | 0 |
| 0.9493055555555556 | 0 |
| 0.9500000000000001 | 0 |
| 0.9506944444444444 | 0 |
| 0.9513888888888888 | 0 |
| 0.9520833333333334 | 0 |
| 0.9527777777777778 | 0 |
| 0.9534722222222222 | 0 |
| 0.9541666666666666 | 0 |
| 0.9548611111111112 | 0 |
| 0.9555555555555556 | 0 |
| 0.9562499999999999 | 0 |
| 0.9569444444444444 | 0 |
| 0.9576388888888889 | 0 |
| 0.9583333333333334 | 0 |
| 0.9590277777777777 | 0 |
| 0.9597222222222223 | 0 |
| 0.9604166666666667 | 0 |
| 0.9611111111111111 | 0 |
| 0.9618055555555555 | 0 |
| 0.9625 | 0 |
| 0.9631944444444445 | 0 |
| 0.9638888888888889 | 0 |
| 0.9645833333333332 | 0 |
| 0.9652777777777778 | 0 |
| 0.9659722222222222 | 0 |
| 0.9666666666666667 | 0 |
| 0.967361111111111 | 0 |
| 0.9680555555555556 | 0 |
| 0.96875 | 0 |
| 0.9694444444444444 | 0 |
| 0.970138888888889 | 0 |
| 0.9708333333333333 | 0 |
| 0.9715277777777778 | 0 |
| 0.9722222222222222 | 0 |
| 0.9729166666666668 | 0 |
| 0.9736111111111111 | 0 |
| 0.9743055555555555 | 0 |
| 0.975 | 0 |
| 0.9756944444444445 | 0 |
| 0.9763888888888889 | 0 |
| 0.9770833333333333 | 0 |
| 0.9777777777777777 | 0 |
| 0.9784722222222223 | 0 |
| 0.9791666666666666 | 0 |
| 0.9798611111111111 | 0 |
| 0.9805555555555556 | 0 |
| 0.9812500000000001 | 0 |
| 0.9819444444444444 | 0 |
| 0.9826388888888888 | 0 |
| 0.9833333333333334 | 0 |
| 0.9840277777777778 | 0 |
| 0.9847222222222222 | 0 |
| 0.9854166666666666 | 0 |
| 0.9861111111111112 | 0 |
| 0.9868055555555556 | 0 |
| 0.9874999999999999 | 0 |
| 0.9881944444444444 | 0 |
| 0.9888888888888889 | 0 |
| 0.9895833333333334 | 0 |
| 0.9902777777777777 | 0 |
| 0.9909722222222223 | 0 |
| 0.9916666666666667 | 0 |
| 0.9923611111111111 | 0 |
| 0.9930555555555555 | 0 |
| 0.99375 | 0 |
| 0.9944444444444445 | 0 |
| 0.9951388888888889 | 0 |
| 0.9958333333333332 | 0 |
| 0.9965277777777778 | 0 |
| 0.9972222222222222 | 0 |
| 0.9979166666666667 | 0 |
| 0.998611111111111 | 0 |
| 0.9993055555555556 | 0 |